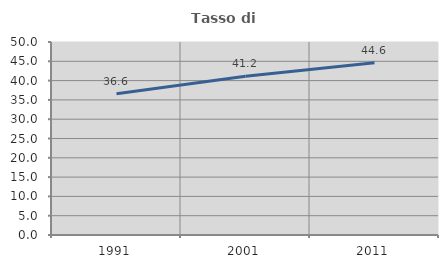
| Category | Tasso di occupazione   |
|---|---|
| 1991.0 | 36.574 |
| 2001.0 | 41.15 |
| 2011.0 | 44.615 |